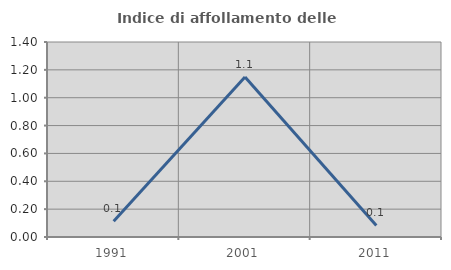
| Category | Indice di affollamento delle abitazioni  |
|---|---|
| 1991.0 | 0.113 |
| 2001.0 | 1.148 |
| 2011.0 | 0.083 |